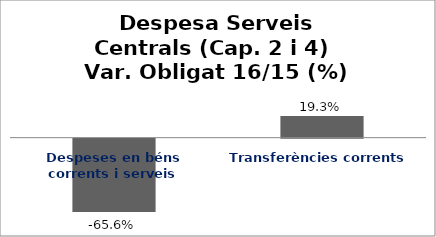
| Category | Series 0 |
|---|---|
| Despeses en béns corrents i serveis | -0.656 |
| Transferències corrents | 0.193 |